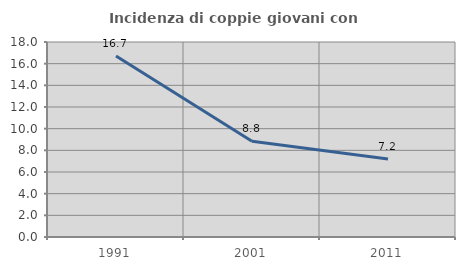
| Category | Incidenza di coppie giovani con figli |
|---|---|
| 1991.0 | 16.714 |
| 2001.0 | 8.84 |
| 2011.0 | 7.2 |